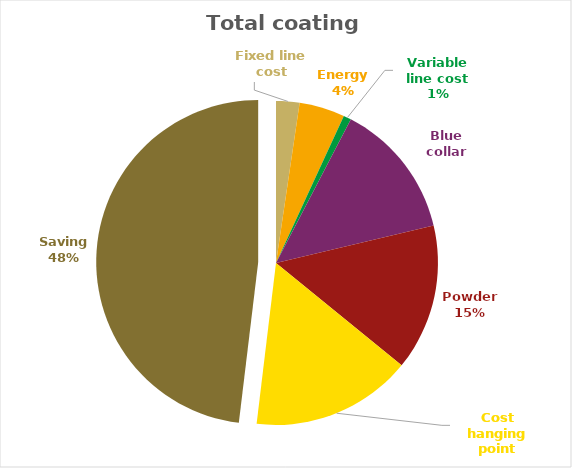
| Category | Series 0 | Series 1 |
|---|---|---|
| Fixed line cost | 0.003 | 0.023 |
| Energy | 0.007 | 0.045 |
| Variable line cost | 0.001 | 0.008 |
| Blue collar | 0.02 | 0.136 |
| Powder  | 0.022 | 0.146 |
| Cost hanging point | 0.024 | 0.16 |
| Saving | 0.072 | 0.481 |